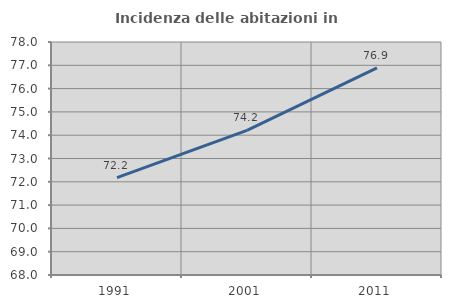
| Category | Incidenza delle abitazioni in proprietà  |
|---|---|
| 1991.0 | 72.177 |
| 2001.0 | 74.21 |
| 2011.0 | 76.891 |